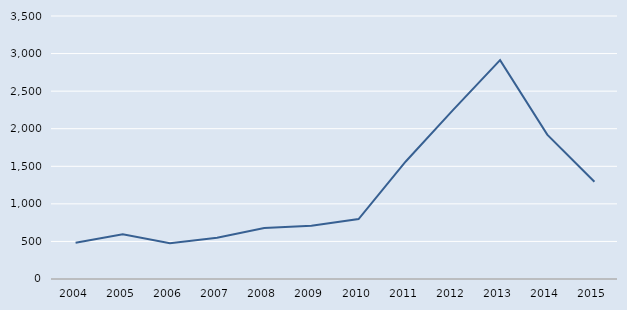
| Category | Series 0 |
|---|---|
| 2004.0 | 482 |
| 2005.0 | 595 |
| 2006.0 | 477 |
| 2007.0 | 550 |
| 2008.0 | 679 |
| 2009.0 | 708 |
| 2010.0 | 798 |
| 2011.0 | 1564 |
| 2012.0 | 2247 |
| 2013.0 | 2913 |
| 2014.0 | 1921 |
| 2015.0 | 1294 |